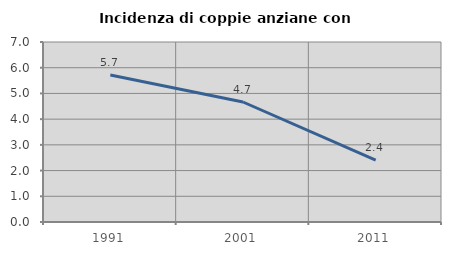
| Category | Incidenza di coppie anziane con figli |
|---|---|
| 1991.0 | 5.714 |
| 2001.0 | 4.667 |
| 2011.0 | 2.41 |